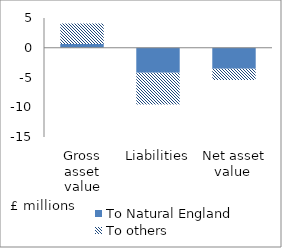
| Category | To Natural England | To others |
|---|---|---|
| Gross asset value | 0.644 | 3.45 |
| Liabilities | -4.19 | -5.338 |
| Net asset value  | -3.546 | -1.887 |